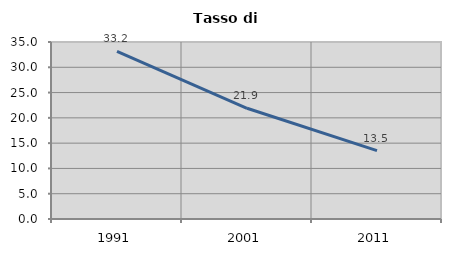
| Category | Tasso di disoccupazione   |
|---|---|
| 1991.0 | 33.15 |
| 2001.0 | 21.899 |
| 2011.0 | 13.527 |